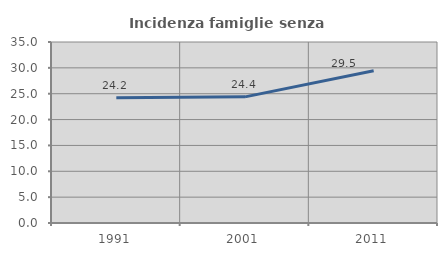
| Category | Incidenza famiglie senza nuclei |
|---|---|
| 1991.0 | 24.214 |
| 2001.0 | 24.393 |
| 2011.0 | 29.456 |